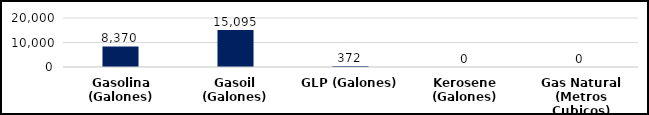
| Category | Series 0 |
|---|---|
| Gasolina (Galones) | 8370 |
| Gasoil (Galones) | 15095 |
| GLP (Galones) | 372 |
| Kerosene (Galones) | 0 |
| Gas Natural (Metros Cubicos) | 0 |